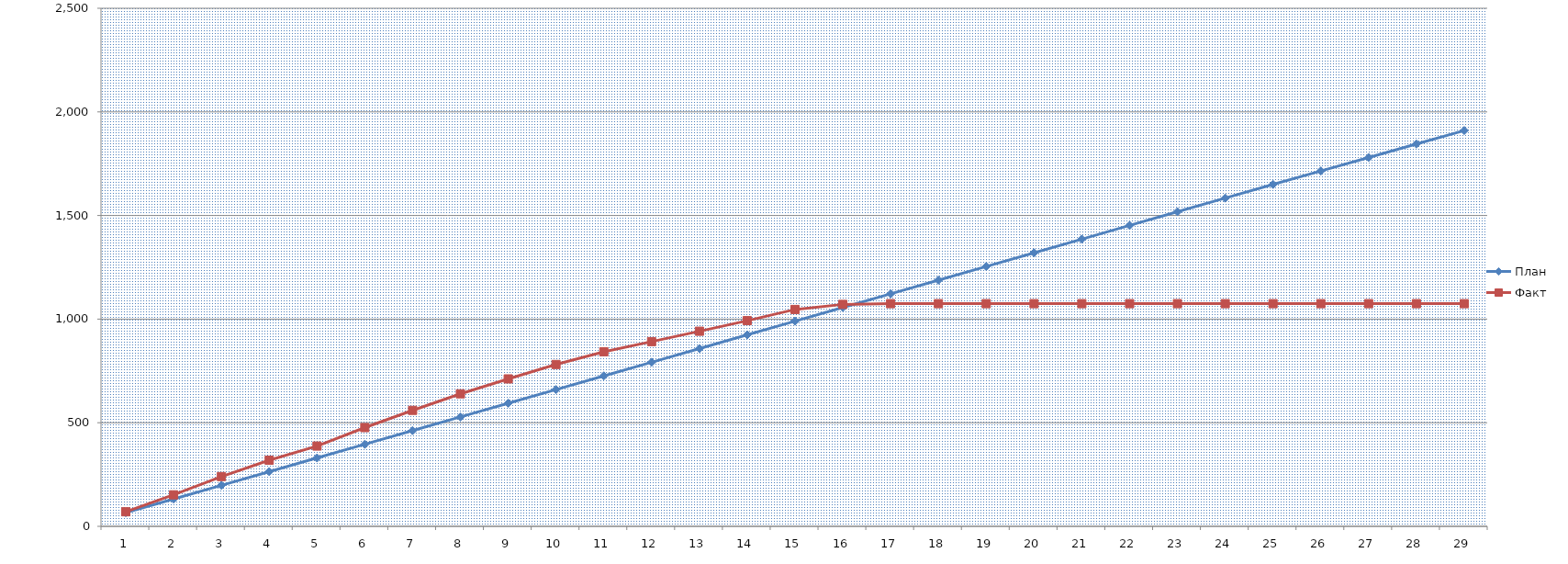
| Category | План | Факт |
|---|---|---|
| 0 | 66 | 70.25 |
| 1 | 132 | 152 |
| 2 | 198 | 240.25 |
| 3 | 264 | 319 |
| 4 | 330 | 387.5 |
| 5 | 396 | 476.5 |
| 6 | 462 | 559.75 |
| 7 | 528 | 639.5 |
| 8 | 594 | 711.5 |
| 9 | 660 | 781 |
| 10 | 726 | 842.5 |
| 11 | 792 | 891.5 |
| 12 | 858 | 941.5 |
| 13 | 924 | 992.5 |
| 14 | 990 | 1046.5 |
| 15 | 1056 | 1071 |
| 16 | 1122 | 1074.5 |
| 17 | 1188 | 1074.5 |
| 18 | 1254 | 1074.5 |
| 19 | 1320 | 1074.5 |
| 20 | 1386 | 1074.5 |
| 21 | 1452 | 1074.5 |
| 22 | 1518 | 1074.5 |
| 23 | 1584 | 1074.5 |
| 24 | 1650 | 1074.5 |
| 25 | 1715 | 1074.5 |
| 26 | 1780 | 1074.5 |
| 27 | 1845 | 1074.5 |
| 28 | 1910 | 1074.5 |